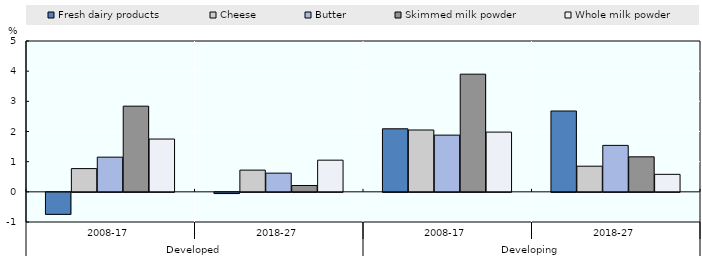
| Category | Fresh dairy products | Cheese | Butter | Skimmed milk powder | Whole milk powder |
|---|---|---|---|---|---|
| 0 | -0.73 | 0.77 | 1.15 | 2.84 | 1.75 |
| 1 | -0.04 | 0.72 | 0.62 | 0.21 | 1.05 |
| 2 | 2.09 | 2.05 | 1.88 | 3.9 | 1.98 |
| 3 | 2.68 | 0.85 | 1.54 | 1.16 | 0.58 |